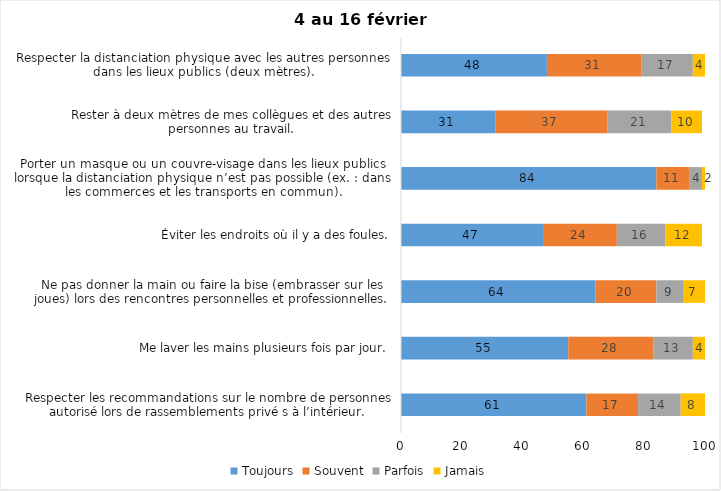
| Category | Toujours | Souvent | Parfois | Jamais |
|---|---|---|---|---|
| Respecter les recommandations sur le nombre de personnes autorisé lors de rassemblements privé s à l’intérieur. | 61 | 17 | 14 | 8 |
| Me laver les mains plusieurs fois par jour. | 55 | 28 | 13 | 4 |
| Ne pas donner la main ou faire la bise (embrasser sur les joues) lors des rencontres personnelles et professionnelles. | 64 | 20 | 9 | 7 |
| Éviter les endroits où il y a des foules. | 47 | 24 | 16 | 12 |
| Porter un masque ou un couvre-visage dans les lieux publics lorsque la distanciation physique n’est pas possible (ex. : dans les commerces et les transports en commun). | 84 | 11 | 4 | 2 |
| Rester à deux mètres de mes collègues et des autres personnes au travail. | 31 | 37 | 21 | 10 |
| Respecter la distanciation physique avec les autres personnes dans les lieux publics (deux mètres). | 48 | 31 | 17 | 4 |